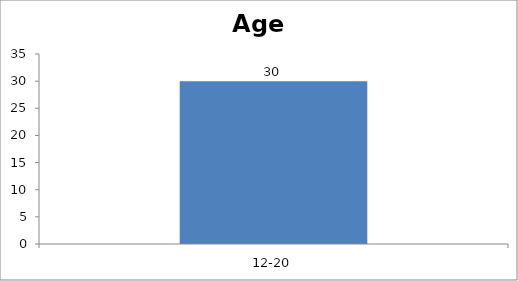
| Category | Age |
|---|---|
| 12-20 | 30 |